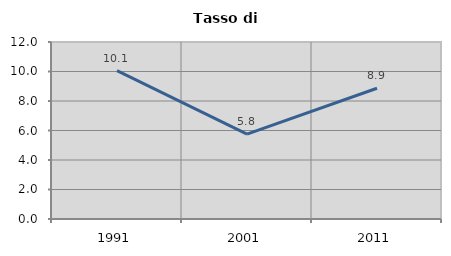
| Category | Tasso di disoccupazione   |
|---|---|
| 1991.0 | 10.055 |
| 2001.0 | 5.751 |
| 2011.0 | 8.865 |